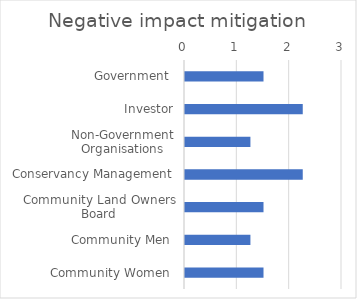
| Category | Negative impact mitigation |
|---|---|
| Government  | 1.5 |
| Investor | 2.25 |
| Non-Government Organisations | 1.25 |
| Conservancy Management | 2.25 |
| Community Land Owners Board | 1.5 |
| Community Men  | 1.25 |
| Community Women  | 1.5 |